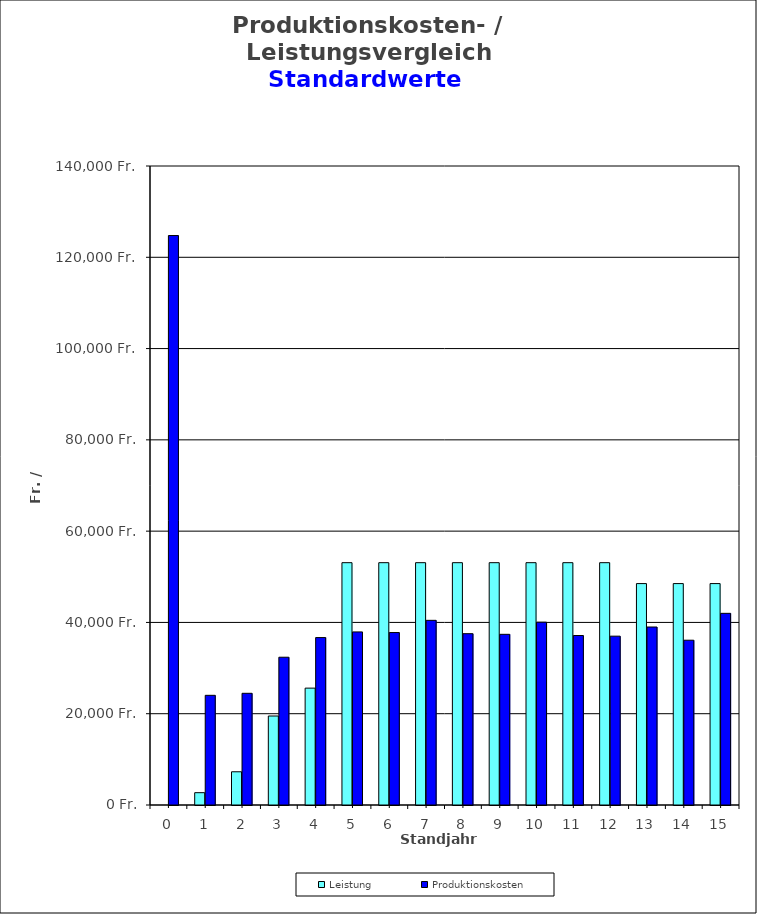
| Category | Leistung | Produktionskosten |
|---|---|---|
| 0.0 | 0 | 124765.916 |
| 1.0 | 2700 | 24030.357 |
| 2.0 | 7281.044 | 24473.16 |
| 3.0 | 19497.161 | 32375.185 |
| 4.0 | 25605.22 | 36681.76 |
| 5.0 | 53091.483 | 37921.427 |
| 6.0 | 53091.483 | 37784.896 |
| 7.0 | 53091.483 | 40457.137 |
| 8.0 | 53091.483 | 37533.428 |
| 9.0 | 53091.483 | 37393.405 |
| 10.0 | 53091.483 | 40062.122 |
| 11.0 | 53091.483 | 37134.858 |
| 12.0 | 53091.483 | 36991.249 |
| 13.0 | 48510.439 | 38998.017 |
| 14.0 | 48510.439 | 36102.405 |
| 15.0 | 48510.439 | 41990.733 |